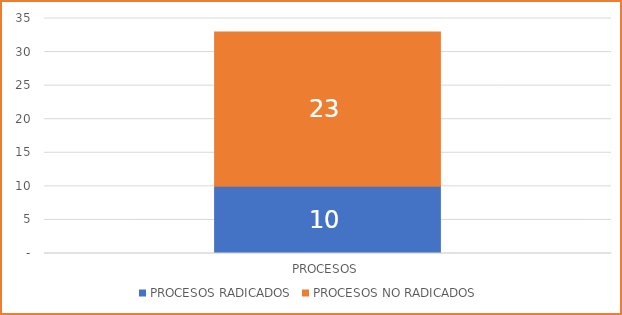
| Category |  PROCESOS RADICADOS  |  PROCESOS NO RADICADOS  |
|---|---|---|
|  PROCESOS  | 10 | 23 |